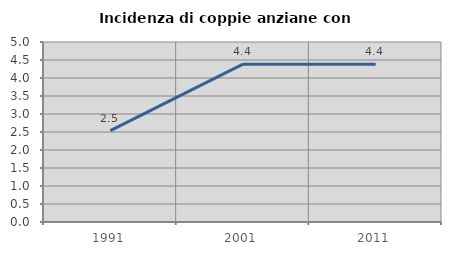
| Category | Incidenza di coppie anziane con figli |
|---|---|
| 1991.0 | 2.537 |
| 2001.0 | 4.384 |
| 2011.0 | 4.381 |